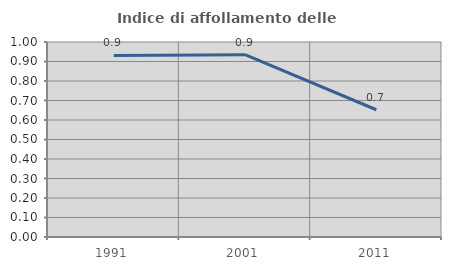
| Category | Indice di affollamento delle abitazioni  |
|---|---|
| 1991.0 | 0.931 |
| 2001.0 | 0.935 |
| 2011.0 | 0.653 |